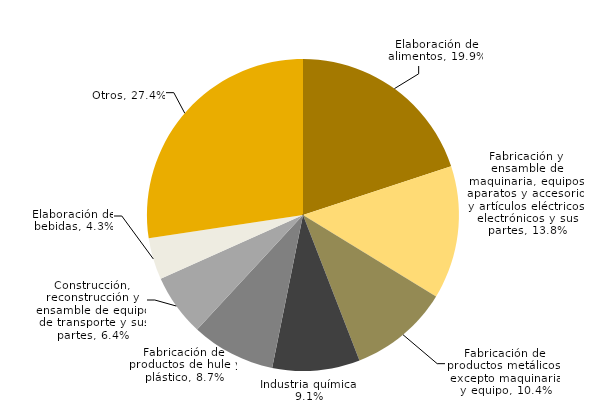
| Category | Series 0 |
|---|---|
| Elaboración de alimentos. | 0.199 |
| Fabricación y ensamble de maquinaria, equipos, aparatos y accesorios y artículos eléctricos, electrónicos y sus partes. | 0.138 |
| Fabricación de productos metálicos, excepto maquinaria y equipo. | 0.104 |
| Industria química. | 0.091 |
| Fabricación de productos de hule y plástico. | 0.087 |
| Construcción, reconstrucción y ensamble de equipo de transporte y sus partes. | 0.064 |
| Elaboración de bebidas. | 0.043 |
| Otros | 0.274 |